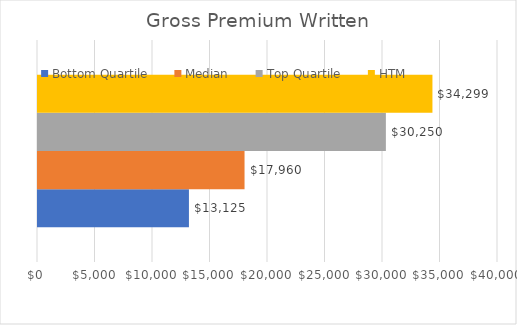
| Category | Bottom Quartile | Median | Top Quartile | HTM  |
|---|---|---|---|---|
| 0 | 13125 | 17960 | 30250.27 | 34299 |